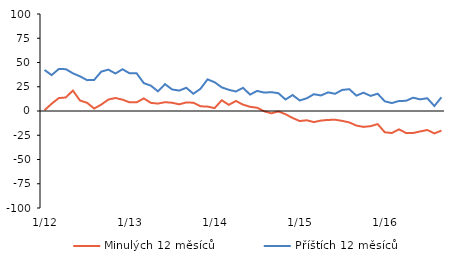
| Category | Minulých 12 měsíců | Příštích 12 měsíců |
|---|---|---|
|  1/12 | 0.85 | 42.3 |
|  2/12 | 7.49 | 37.02 |
|  3/12 | 13.29 | 43.26 |
|  4/12 | 13.96 | 43.14 |
|  5/12 | 21.08 | 38.87 |
|  6/12 | 10.81 | 35.74 |
|  7/12 | 8.46 | 31.81 |
|  8/12 | 2.55 | 32.03 |
|  9/12 | 6.58 | 40.6 |
|  10/12 | 11.79 | 42.65 |
|  11/12 | 13.41 | 38.66 |
|  12/12 | 11.71 | 43.07 |
|  1/13 | 8.92 | 38.82 |
|  2/13 | 8.92 | 38.82 |
|  3/13 | 12.98 | 28.75 |
|  4/13 | 8.4 | 26.12 |
|  5/13 | 7.64 | 20.26 |
|  6/13 | 9.1 | 27.71 |
|  7/13 | 8.51 | 22.2 |
|  8/13 | 6.89 | 21.06 |
|  9/13 | 8.81 | 23.95 |
|  10/13 | 8.54 | 17.76 |
|  11/13 | 4.88 | 22.87 |
|  12/13 | 4.53 | 32.62 |
|  1/14 | 2.99 | 29.64 |
|  2/14 | 11.1 | 24.37 |
|  3/14 | 6.35 | 21.86 |
|  4/14 | 10.34 | 20.09 |
|  5/14 | 6.57 | 23.91 |
|  6/14 | 4.33 | 16.91 |
|  7/14 | 3.35 | 20.75 |
|  8/14 | -0.33 | 18.95 |
|  9/14 | -2.37 | 19.44 |
|  10/14 | -0.5 | 18.32 |
|  11/14 | -3.3 | 11.85 |
|  12/14 | -7.21 | 16.46 |
|  1/15 | -10.32 | 10.88 |
|  2/15 | -9.55 | 13.1 |
|  3/15 | -11.45 | 17.32 |
|  4/15 | -9.85 | 16.04 |
|  5/15 | -9.22 | 19.19 |
|  6/15 | -8.99 | 17.77 |
|  7/15 | -10.2 | 21.74 |
|  8/15 | -11.76 | 22.49 |
|  9/15 | -15.03 | 15.86 |
|  10/15 | -16.38 | 18.89 |
|  11/15 | -15.64 | 15.55 |
|  12/15 | -13.49 | 17.84 |
|  1/16 | -21.91 | 10.03 |
|  2/16 | -22.72 | 8.16 |
|  3/16 | -18.91 | 10.34 |
|  4/16 | -22.65 | 10.48 |
|  5/16 | -22.69 | 13.73 |
|  6/16 | -21.05 | 11.99 |
|  7/16 | -19.56 | 13.15 |
|  8/16 | -23.1 | 5.15 |
|  9/16 | -20.21 | 14.17 |